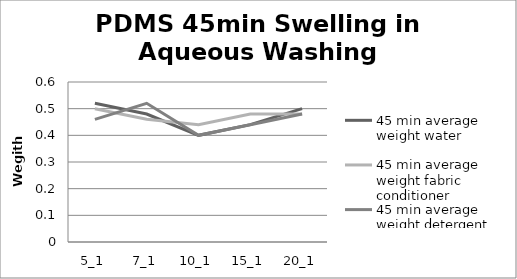
| Category | 45 min average weight water | 45 min average weight fabric conditioner | 45 min average weight detergent |
|---|---|---|---|
| 5_1 | 0.52 | 0.5 | 0.46 |
| 7_1 | 0.48 | 0.46 | 0.52 |
| 10_1 | 0.4 | 0.44 | 0.4 |
| 15_1 | 0.44 | 0.48 | 0.44 |
| 20_1 | 0.5 | 0.48 | 0.48 |